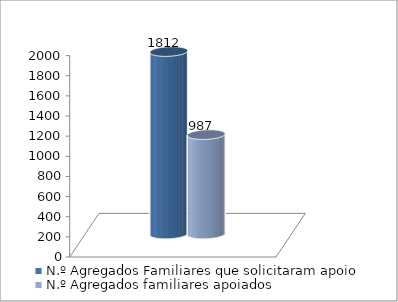
| Category | N.º Agregados Familiares que solicitaram apoio | N.º Agregados familiares apoiados |
|---|---|---|
| 0 | 1812 | 987 |